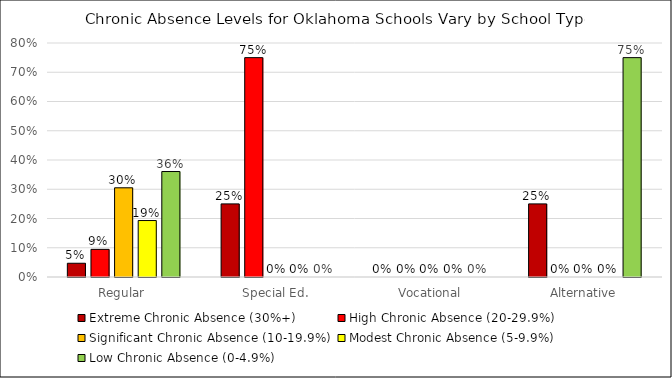
| Category | Extreme Chronic Absence (30%+) | High Chronic Absence (20-29.9%) | Significant Chronic Absence (10-19.9%) | Modest Chronic Absence (5-9.9%) | Low Chronic Absence (0-4.9%) |
|---|---|---|---|---|---|
| Regular | 0.047 | 0.094 | 0.305 | 0.193 | 0.361 |
| Special Ed. | 0.25 | 0.75 | 0 | 0 | 0 |
| Vocational | 0 | 0 | 0 | 0 | 0 |
| Alternative | 0.25 | 0 | 0 | 0 | 0.75 |